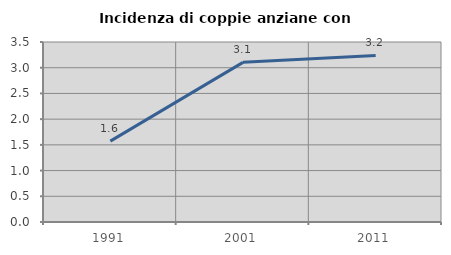
| Category | Incidenza di coppie anziane con figli |
|---|---|
| 1991.0 | 1.572 |
| 2001.0 | 3.104 |
| 2011.0 | 3.238 |